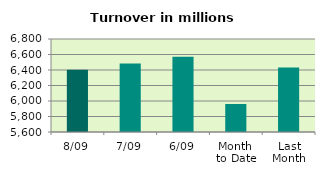
| Category | Series 0 |
|---|---|
| 8/09 | 6402.313 |
| 7/09 | 6485.043 |
| 6/09 | 6569.97 |
| Month 
to Date | 5960.964 |
| Last
Month | 6430.895 |